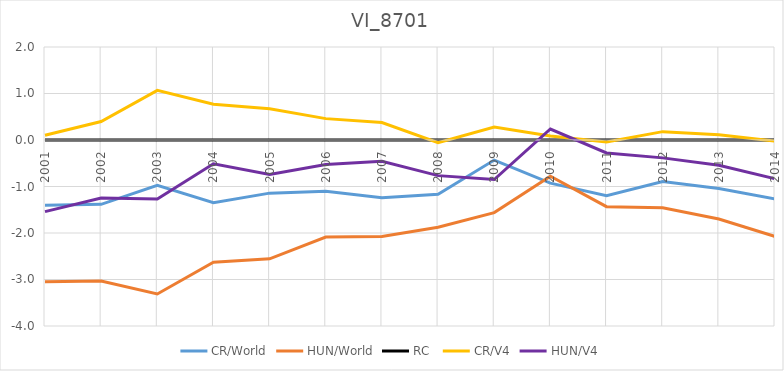
| Category | CR/World | HUN/World | RC  | CR/V4 | HUN/V4 |
|---|---|---|---|---|---|
| 2001.0 | -1.405 | -3.048 | 0 | 0.103 | -1.541 |
| 2002.0 | -1.384 | -3.032 | 0 | 0.399 | -1.25 |
| 2003.0 | -0.974 | -3.311 | 0 | 1.068 | -1.269 |
| 2004.0 | -1.348 | -2.63 | 0 | 0.771 | -0.511 |
| 2005.0 | -1.143 | -2.555 | 0 | 0.67 | -0.742 |
| 2006.0 | -1.1 | -2.087 | 0 | 0.46 | -0.527 |
| 2007.0 | -1.242 | -2.077 | 0 | 0.376 | -0.459 |
| 2008.0 | -1.166 | -1.877 | 0 | -0.055 | -0.766 |
| 2009.0 | -0.431 | -1.562 | 0 | 0.281 | -0.85 |
| 2010.0 | -0.927 | -0.778 | 0 | 0.088 | 0.237 |
| 2011.0 | -1.198 | -1.433 | 0 | -0.044 | -0.279 |
| 2012.0 | -0.893 | -1.457 | 0 | 0.18 | -0.384 |
| 2013.0 | -1.043 | -1.7 | 0 | 0.114 | -0.543 |
| 2014.0 | -1.268 | -2.073 | 0 | -0.026 | -0.831 |